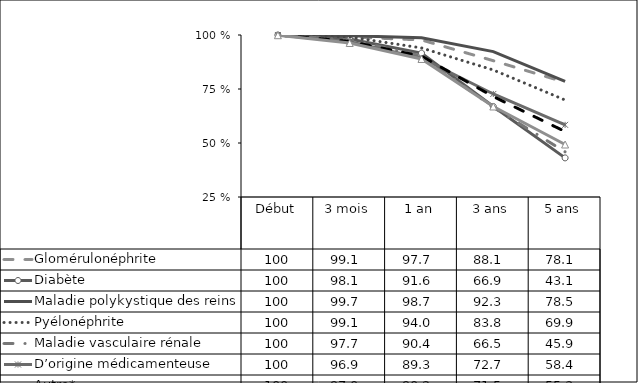
| Category | Glomérulonéphrite | Diabète | Maladie polykystique des reins | Pyélonéphrite | Maladie vasculaire rénale | D’origine médicamenteuse | Autre* | Inconnu |
|---|---|---|---|---|---|---|---|---|
| Début | 100 | 100 | 100 | 100 | 100 | 100 | 100 | 99.9 |
| 3 mois | 99.1 | 98.1 | 99.7 | 99.1 | 97.7 | 96.9 | 97 | 96.3 |
| 1 an | 97.7 | 91.6 | 98.7 | 94 | 90.4 | 89.3 | 90.2 | 88.9 |
| 3 ans | 88.1 | 66.9 | 92.3 | 83.8 | 66.5 | 72.7 | 71.5 | 66.9 |
| 5 ans | 78.1 | 43.1 | 78.5 | 69.9 | 45.9 | 58.4 | 55.3 | 49.3 |